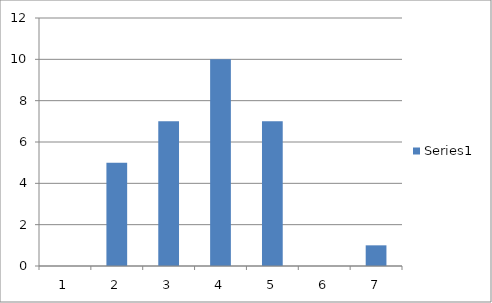
| Category | Series 0 |
|---|---|
| 0 | 0 |
| 1 | 5 |
| 2 | 7 |
| 3 | 10 |
| 4 | 7 |
| 5 | 0 |
| 6 | 1 |